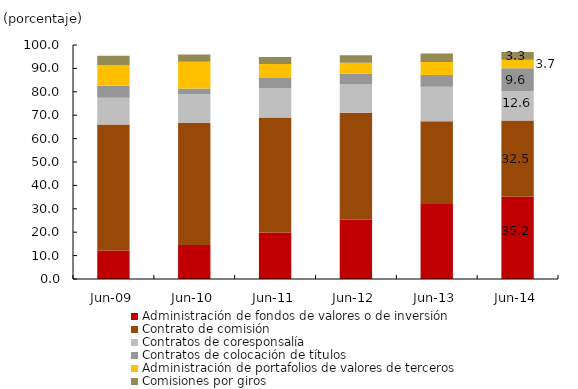
| Category | Administración de fondos de valores o de inversión | Contrato de comisión | Contratos de coresponsalía | Contratos de colocación de títulos | Administración de portafolios de valores de terceros | Comisiones por giros  |
|---|---|---|---|---|---|---|
| 2009-06-01 | 12.161 | 53.861 | 11.458 | 5.069 | 8.871 | 3.984 |
| 2010-06-01 | 14.497 | 52.161 | 12.323 | 2.469 | 11.34 | 3.14 |
| 2011-06-01 | 19.834 | 49.194 | 12.486 | 4.363 | 5.99 | 3.04 |
| 2012-06-01 | 25.388 | 45.622 | 12.096 | 4.762 | 4.553 | 3.181 |
| 2013-06-01 | 32.015 | 35.431 | 14.73 | 5.015 | 5.572 | 3.61 |
| 2014-06-01 | 35.246 | 32.498 | 12.634 | 9.635 | 3.708 | 3.258 |